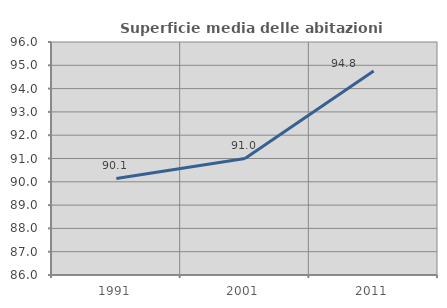
| Category | Superficie media delle abitazioni occupate |
|---|---|
| 1991.0 | 90.144 |
| 2001.0 | 91.003 |
| 2011.0 | 94.754 |